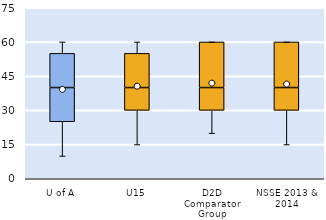
| Category | 25th | 50th | 75th |
|---|---|---|---|
| U of A | 25 | 15 | 15 |
| U15 | 30 | 10 | 15 |
| D2D Comparator Group | 30 | 10 | 20 |
| NSSE 2013 & 2014 | 30 | 10 | 20 |